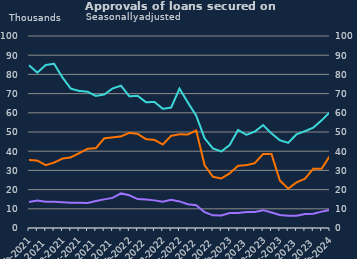
| Category | Remortgaging | Other |
|---|---|---|
| Feb-2021 | 35443 | 13572 |
| Mar-2021 | 35098 | 14318 |
| Apr-2021 | 32726 | 13735 |
| May-2021 | 34061 | 13632 |
| Jun-2021 | 36165 | 13457 |
| Jul-2021 | 36781 | 13172 |
| Aug-2021 | 38973 | 13159 |
| Sep-2021 | 41249 | 13043 |
| Oct-2021 | 41579 | 14091 |
| Nov-2021 | 46693 | 14913 |
| Dec-2021 | 47199 | 15690 |
| Jan-2022 | 47703 | 18010 |
| Feb-2022 | 49562 | 17038 |
| Mar-2022 | 49004 | 15061 |
| Apr-2022 | 46247 | 14858 |
| May-2022 | 45892 | 14388 |
| Jun-2022 | 43502 | 13674 |
| Jul-2022 | 48038 | 14700 |
| Aug-2022 | 48797 | 13847 |
| Sep-2022 | 48720 | 12349 |
| Oct-2022 | 50800 | 11845 |
| Nov-2022 | 32722 | 8243 |
| Dec-2022 | 26673 | 6581 |
| Jan-2023 | 25809 | 6530 |
| Feb-2023 | 28460 | 7789 |
| Mar-2023 | 32394 | 7852 |
| Apr-2023 | 32736 | 8381 |
| May-2023 | 33764 | 8286 |
| Jun-2023 | 38541 | 9293 |
| Jul-2023 | 38556 | 8071 |
| Aug-2023 | 24743 | 6807 |
| Sep-2023 | 20492 | 6394 |
| Oct-2023 | 23774 | 6338 |
| Nov-2023 | 25640 | 7321 |
| Dec-2023 | 30909 | 7392 |
| Jan-2024 | 30871 | 8529 |
| Feb-2024 | 37698 | 9418 |